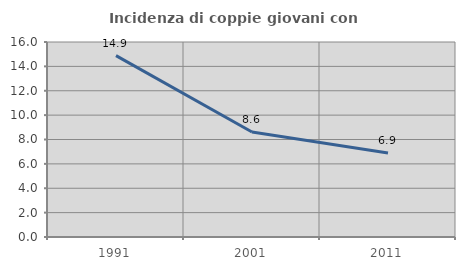
| Category | Incidenza di coppie giovani con figli |
|---|---|
| 1991.0 | 14.884 |
| 2001.0 | 8.612 |
| 2011.0 | 6.897 |